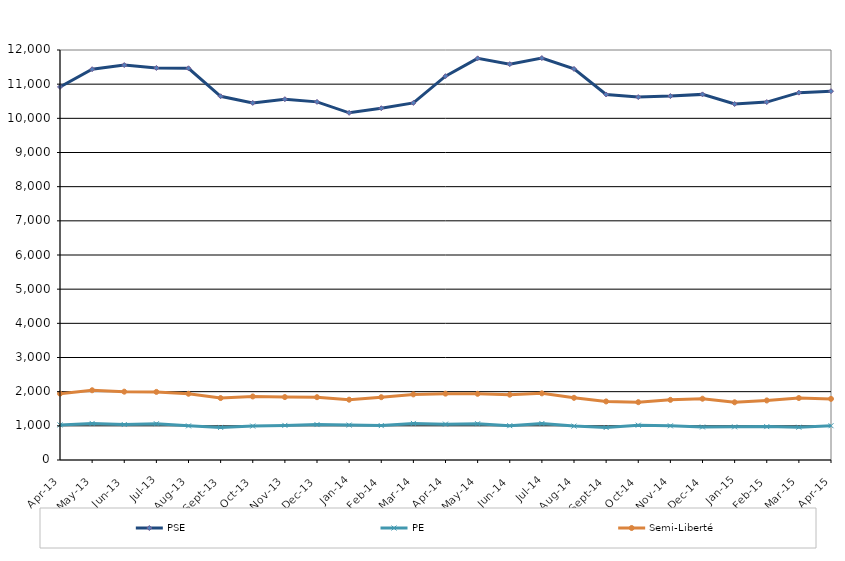
| Category | PSE | PE | Semi-Liberté |
|---|---|---|---|
| 2013-04-01 | 10919 | 1027 | 1942 |
| 2013-05-01 | 11438 | 1070 | 2041 |
| 2013-06-01 | 11559 | 1038 | 2000 |
| 2013-07-01 | 11475 | 1061 | 1993 |
| 2013-08-01 | 11465 | 999 | 1939 |
| 2013-09-01 | 10646 | 954 | 1813 |
| 2013-10-01 | 10451 | 993 | 1860 |
| 2013-11-01 | 10560 | 1013 | 1842 |
| 2013-12-01 | 10482 | 1037 | 1838 |
| 2014-01-01 | 10161 | 1022 | 1765 |
| 2014-02-01 | 10296 | 1007 | 1838 |
| 2014-03-01 | 10452 | 1071 | 1920 |
| 2014-04-01 | 11234 | 1050 | 1942 |
| 2014-05-01 | 11755 | 1062 | 1937 |
| 2014-06-01 | 11586 | 1005 | 1912 |
| 2014-07-01 | 11763 | 1068 | 1951 |
| 2014-08-01 | 11447 | 992 | 1820 |
| 2014-09-01 | 10698 | 951 | 1714 |
| 2014-10-01 | 10622 | 1018 | 1692 |
| 2014-11-01 | 10651 | 1000 | 1760 |
| 2014-12-01 | 10701 | 966 | 1794 |
| 2015-01-01 | 10419 | 970 | 1689 |
| 2015-02-01 | 10476 | 977 | 1743 |
| 2015-03-01 | 10752 | 959 | 1814 |
| 2015-04-01 | 10794 | 1003 | 1789 |